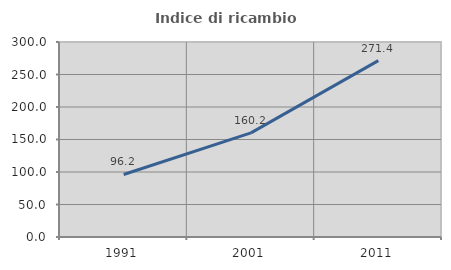
| Category | Indice di ricambio occupazionale  |
|---|---|
| 1991.0 | 96.185 |
| 2001.0 | 160.169 |
| 2011.0 | 271.379 |